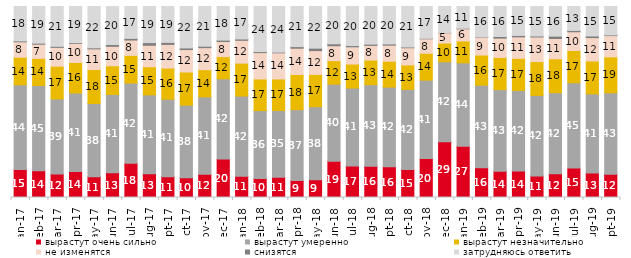
| Category | вырастут очень сильно | вырастут умеренно | вырастут незначительно | не изменятся | снизятся | затрудняюсь ответить |
|---|---|---|---|---|---|---|
| 2017-01-01 | 14.65 | 44.35 | 14.45 | 8.05 | 0.5 | 18 |
| 2017-02-01 | 13.95 | 44.7 | 14.2 | 7.4 | 0.55 | 19.2 |
| 2017-03-01 | 12.25 | 39.35 | 17.15 | 9.85 | 0.55 | 20.85 |
| 2017-04-01 | 13.55 | 41.15 | 16 | 9.95 | 0.4 | 18.95 |
| 2017-05-01 | 10.9 | 38.3 | 17.8 | 10.8 | 0.55 | 21.65 |
| 2017-06-01 | 13 | 40.95 | 15 | 10.2 | 0.95 | 19.9 |
| 2017-07-01 | 17.95 | 41.95 | 14.5 | 8.05 | 0.85 | 16.7 |
| 2017-08-01 | 12.5 | 41.25 | 14.7 | 11.25 | 1.4 | 18.9 |
| 2017-09-01 | 10.9 | 40.55 | 16.3 | 12.4 | 1.05 | 18.8 |
| 2017-10-01 | 10.4 | 37.95 | 17.35 | 11.75 | 0.85 | 21.7 |
| 2017-11-01 | 12.2 | 40.5 | 14.2 | 11.55 | 0.75 | 20.8 |
| 2017-12-01 | 20.1 | 42.05 | 11.6 | 7.9 | 0.75 | 17.6 |
| 2018-01-01 | 11.1 | 42 | 17.25 | 11.95 | 0.7 | 17 |
| 2018-02-01 | 10 | 35.5 | 16.55 | 13.8 | 0.55 | 23.6 |
| 2018-03-01 | 10.65 | 34.9 | 16.5 | 13.7 | 0.35 | 23.9 |
| 2018-04-01 | 8.95 | 37.05 | 18.4 | 13.75 | 0.85 | 21 |
| 2018-05-01 | 9.3 | 38.2 | 16.95 | 12.45 | 1.3 | 21.8 |
| 2018-06-01 | 18.95 | 40.4 | 12.3 | 7.8 | 1.05 | 19.5 |
| 2018-07-01 | 16.55 | 40.75 | 12.55 | 9.05 | 0.65 | 20.45 |
| 2018-08-01 | 16.35 | 42.7 | 12.9 | 7.7 | 0.65 | 19.7 |
| 2018-09-01 | 16.05 | 41.75 | 13.55 | 8.4 | 0.65 | 19.6 |
| 2018-10-01 | 14.6 | 42 | 12.8 | 9 | 0.4 | 21.2 |
| 2018-11-01 | 20.359 | 41.068 | 14.072 | 7.585 | 0.25 | 16.667 |
| 2018-12-01 | 29.25 | 41.8 | 9.8 | 5.4 | 0.1 | 13.65 |
| 2019-01-01 | 26.85 | 43.65 | 11.45 | 6.35 | 0.3 | 11.4 |
| 2019-02-01 | 15.6 | 43.2 | 15.8 | 9.35 | 0.15 | 15.9 |
| 2019-03-01 | 13.774 | 42.715 | 16.808 | 10.144 | 0.845 | 15.714 |
| 2019-04-01 | 13.911 | 42.129 | 16.832 | 11.238 | 0.743 | 15.149 |
| 2019-05-01 | 11.293 | 42.15 | 17.732 | 12.878 | 0.495 | 15.453 |
| 2019-06-01 | 12.419 | 42.444 | 17.756 | 10.623 | 1.247 | 15.511 |
| 2019-07-01 | 15.396 | 44.653 | 16.931 | 9.802 | 0.693 | 12.525 |
| 2019-08-01 | 12.887 | 41.359 | 17.233 | 12.238 | 0.849 | 15.435 |
| 2019-09-01 | 12.228 | 42.574 | 18.812 | 11.139 | 0.347 | 14.901 |